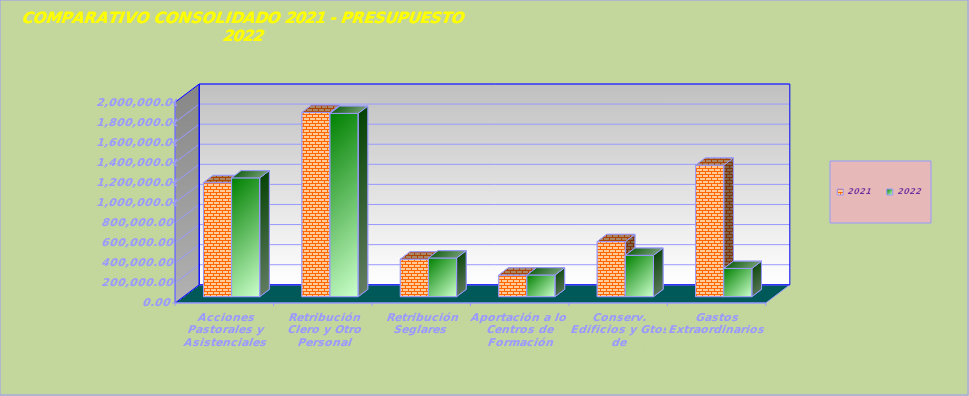
| Category | 2021 | 2022 |
|---|---|---|
| Acciones Pastorales y Asistenciales  | 1135323.48 | 1182864 |
| Retribución Clero y Otro Personal Respons. Pastoral | 1835010.43 | 1825100 |
| Retribución Seglares  | 373437.99 | 385000 |
| Aportación a los Centros de Formación | 214808.25 | 215750 |
| Conserv. Edificios y Gtos. de Funcionamiento  | 548010.57 | 411815 |
| Gastos Extraordinarios  | 1309356.63 | 280985 |